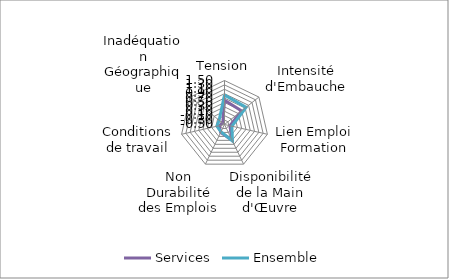
| Category | Services | Ensemble |
|---|---|---|
| Tension | 0.605 | 0.838 |
| Intensité d'Embauche | 0.493 | 0.756 |
| Lien Emploi Formation | -0.248 | -0.154 |
| Disponibilité de la Main d'Œuvre | 0.286 | 0.329 |
| Non Durabilité des Emplois | -0.097 | -0.133 |
| Conditions de travail | -0.26 | -0.146 |
| Inadéquation Géographique | -0.4 | -0.188 |